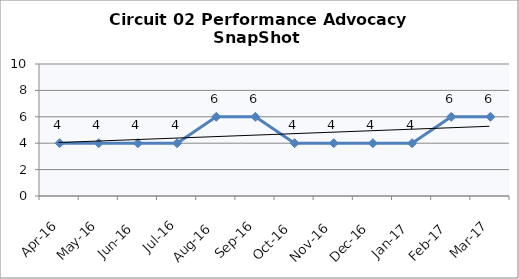
| Category | Circuit 02 |
|---|---|
| Apr-16 | 4 |
| May-16 | 4 |
| Jun-16 | 4 |
| Jul-16 | 4 |
| Aug-16 | 6 |
| Sep-16 | 6 |
| Oct-16 | 4 |
| Nov-16 | 4 |
| Dec-16 | 4 |
| Jan-17 | 4 |
| Feb-17 | 6 |
| Mar-17 | 6 |